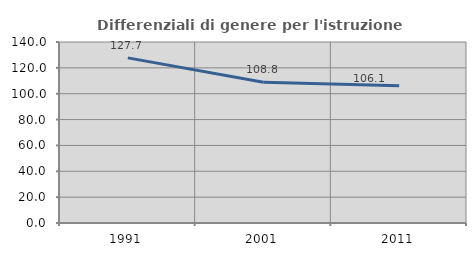
| Category | Differenziali di genere per l'istruzione superiore |
|---|---|
| 1991.0 | 127.71 |
| 2001.0 | 108.846 |
| 2011.0 | 106.078 |